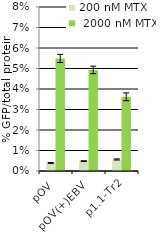
| Category | 200 nM MTX |  2000 nM MTX |
|---|---|---|
| pOV | 0.004 | 0.055 |
| pOV(+)EBV | 0.005 | 0.049 |
| p1.1-Tr2 | 0.006 | 0.036 |